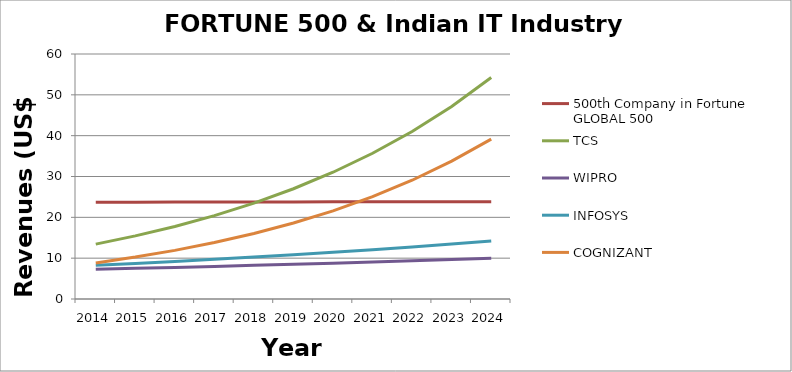
| Category | 500th Company in Fortune GLOBAL 500 | TCS | WIPRO | INFOSYS | COGNIZANT |
|---|---|---|---|---|---|
| 2014.0 | 23.706 | 13.442 | 7.271 | 8.249 | 8.843 |
| 2015.0 | 23.72 | 15.454 | 7.503 | 8.711 | 10.262 |
| 2016.0 | 23.734 | 17.767 | 7.742 | 9.199 | 11.909 |
| 2017.0 | 23.748 | 20.427 | 7.989 | 9.714 | 13.82 |
| 2018.0 | 23.762 | 23.484 | 8.244 | 10.258 | 16.037 |
| 2019.0 | 23.776 | 26.999 | 8.507 | 10.833 | 18.611 |
| 2020.0 | 23.79 | 31.04 | 8.779 | 11.439 | 21.597 |
| 2021.0 | 23.804 | 35.686 | 9.059 | 12.08 | 25.063 |
| 2022.0 | 23.818 | 41.028 | 9.348 | 12.757 | 29.084 |
| 2023.0 | 23.832 | 47.169 | 9.646 | 13.471 | 33.751 |
| 2024.0 | 23.846 | 54.229 | 9.954 | 14.226 | 39.167 |